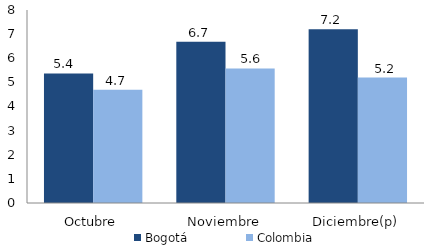
| Category | Bogotá | Colombia |
|---|---|---|
| Octubre | 5.371 | 4.696 |
| Noviembre | 6.686 | 5.577 |
| Diciembre(p) | 7.2 | 5.2 |